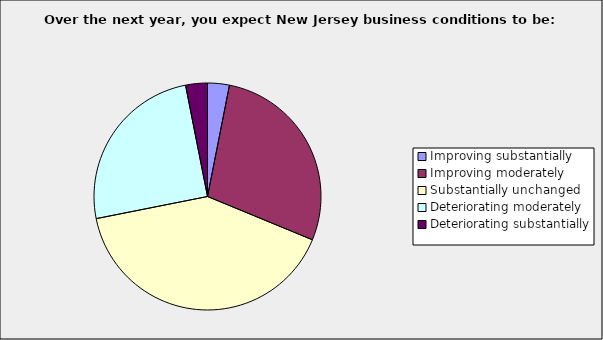
| Category | Series 0 |
|---|---|
| Improving substantially | 0.031 |
| Improving moderately | 0.281 |
| Substantially unchanged | 0.406 |
| Deteriorating moderately | 0.25 |
| Deteriorating substantially | 0.031 |